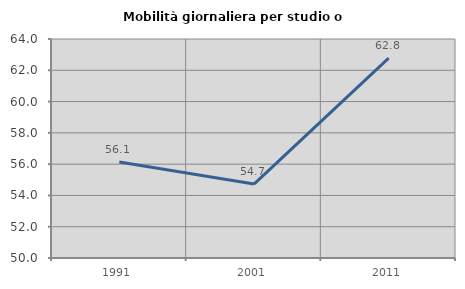
| Category | Mobilità giornaliera per studio o lavoro |
|---|---|
| 1991.0 | 56.14 |
| 2001.0 | 54.727 |
| 2011.0 | 62.781 |